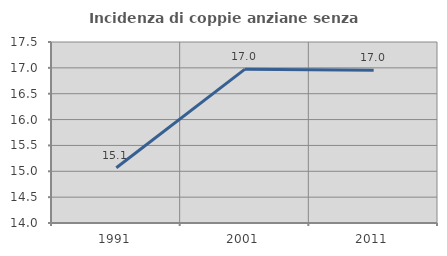
| Category | Incidenza di coppie anziane senza figli  |
|---|---|
| 1991.0 | 15.068 |
| 2001.0 | 16.975 |
| 2011.0 | 16.955 |